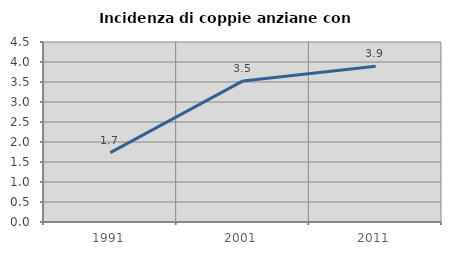
| Category | Incidenza di coppie anziane con figli |
|---|---|
| 1991.0 | 1.734 |
| 2001.0 | 3.527 |
| 2011.0 | 3.895 |